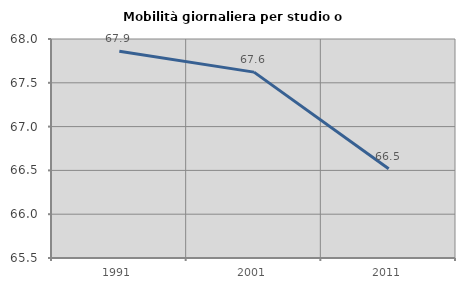
| Category | Mobilità giornaliera per studio o lavoro |
|---|---|
| 1991.0 | 67.859 |
| 2001.0 | 67.622 |
| 2011.0 | 66.518 |